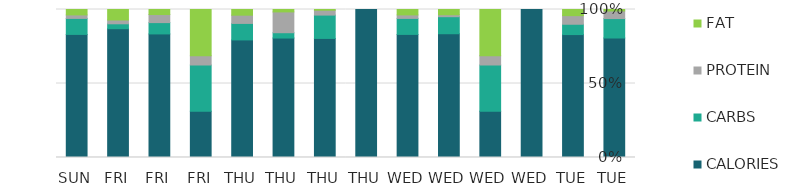
| Category | CALORIES | CARBS | PROTEIN | FAT |
|---|---|---|---|---|
| TUE | 283 | 46 | 18 | 3.5 |
| TUE | 500 | 42 | 35 | 25 |
| WED | 1 | 0 | 0 | 0 |
| WED | 10 | 10 | 2 | 10 |
| WED | 189 | 26 | 3 | 8 |
| WED | 477 | 62 | 13.5 | 21 |
| THU | 1 | 0 | 0 | 0 |
| THU | 245 | 48 | 10 | 1.5 |
| THU | 247 | 11 | 43 | 5 |
| THU | 456 | 64 | 32 | 22 |
| FRI | 10 | 10 | 2 | 10 |
| FRI | 135 | 12.36 | 8.81 | 5.51 |
| FRI | 184 | 7 | 5.43 | 15 |
| SUN | 477 | 62 | 13.5 | 21 |